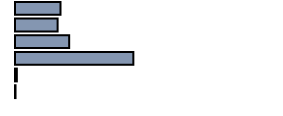
| Category | Series 0 |
|---|---|
| 0 | 17.3 |
| 1 | 16.2 |
| 2 | 20.6 |
| 3 | 45 |
| 4 | 0.7 |
| 5 | 0.2 |